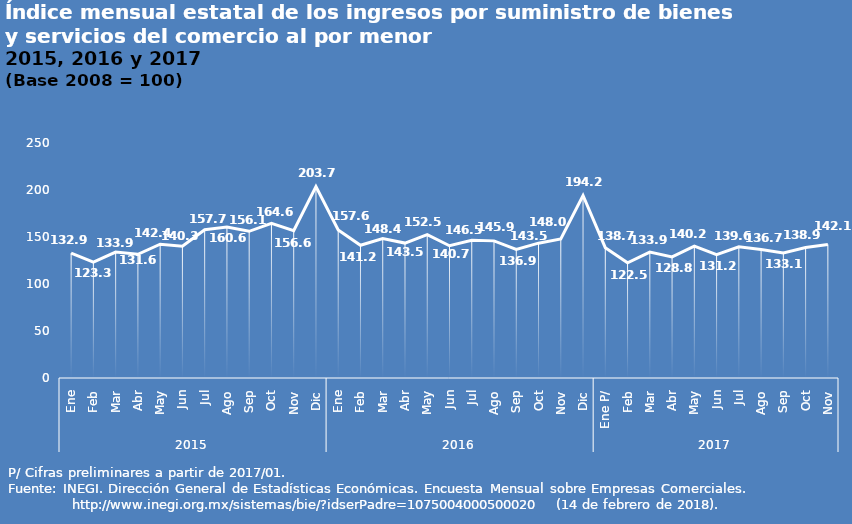
| Category | Series 0 |
|---|---|
| 0 | 132.944 |
| 1 | 123.31 |
| 2 | 133.913 |
| 3 | 131.622 |
| 4 | 142.351 |
| 5 | 140.251 |
| 6 | 157.742 |
| 7 | 160.601 |
| 8 | 156.077 |
| 9 | 164.573 |
| 10 | 156.623 |
| 11 | 203.678 |
| 12 | 157.583 |
| 13 | 141.2 |
| 14 | 148.418 |
| 15 | 143.519 |
| 16 | 152.464 |
| 17 | 140.659 |
| 18 | 146.533 |
| 19 | 145.881 |
| 20 | 136.875 |
| 21 | 143.453 |
| 22 | 147.95 |
| 23 | 194.153 |
| 24 | 138.685 |
| 25 | 122.528 |
| 26 | 133.907 |
| 27 | 128.827 |
| 28 | 140.209 |
| 29 | 131.239 |
| 30 | 139.623 |
| 31 | 136.661 |
| 32 | 133.075 |
| 33 | 138.875 |
| 34 | 142.13 |